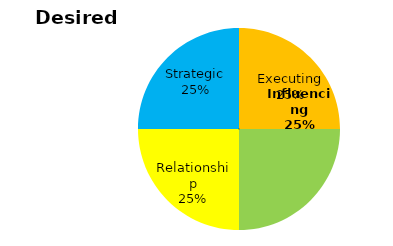
| Category | Series 0 |
|---|---|
| Executing | 0.25 |
| Influencing | 0.25 |
| Relationship | 0.25 |
| Strategic | 0.25 |